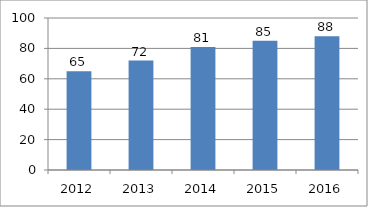
| Category | Series 0 |
|---|---|
| 2012.0 | 65 |
| 2013.0 | 72 |
| 2014.0 | 81 |
| 2015.0 | 85 |
| 2016.0 | 88 |